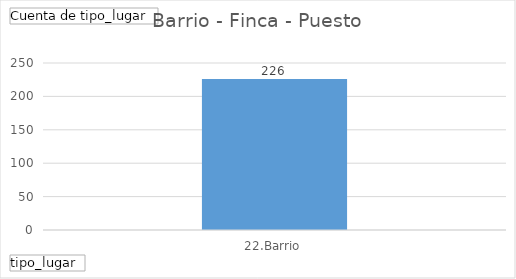
| Category | Total |
|---|---|
| 22.Barrio | 226 |